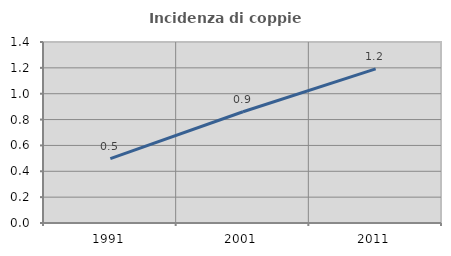
| Category | Incidenza di coppie miste |
|---|---|
| 1991.0 | 0.498 |
| 2001.0 | 0.86 |
| 2011.0 | 1.192 |